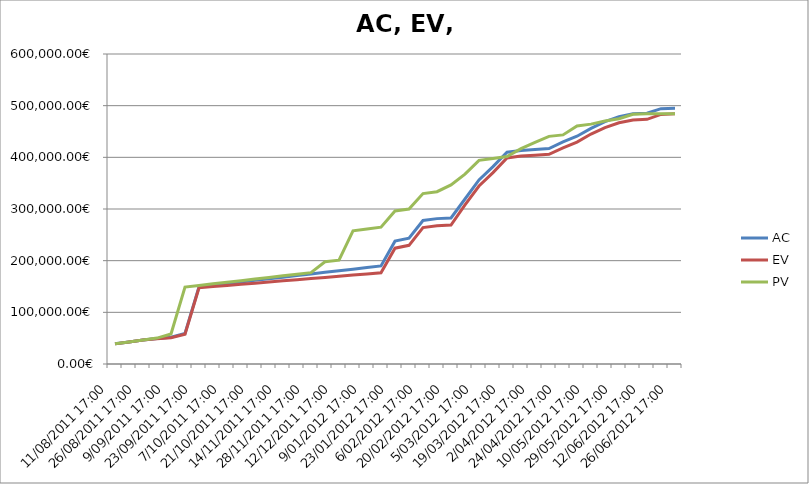
| Category | AC | EV | PV |
|---|---|---|---|
| 11/08/2011 17:00 | 39004.67 | 38967.719 | 39004.67 |
| 19/08/2011 17:00 | 42724.67 | 42650.768 | 42724.67 |
| 26/08/2011 17:00 | 46444.67 | 46333.817 | 46444.67 |
| 2/09/2011 17:00 | 49234.67 | 48729.174 | 50164.67 |
| 9/09/2011 17:00 | 51714.67 | 50695.301 | 58071.77 |
| 16/09/2011 17:00 | 59094.77 | 57653.27 | 148902.723 |
| 23/09/2011 17:00 | 149491.723 | 147599.133 | 152002.723 |
| 30/09/2011 17:00 | 152591.723 | 149824.774 | 155102.723 |
| 7/10/2011 17:00 | 155691.723 | 152050.416 | 158202.723 |
| 14/10/2011 17:00 | 158791.723 | 154276.056 | 161302.723 |
| 21/10/2011 17:00 | 161891.723 | 156501.698 | 164402.723 |
| 28/10/2011 17:00 | 164991.723 | 158727.339 | 167502.723 |
| 14/11/2011 17:00 | 168091.723 | 160952.98 | 170602.723 |
| 21/11/2011 17:00 | 171191.723 | 163178.621 | 173702.723 |
| 28/11/2011 17:00 | 174291.723 | 165404.262 | 176802.723 |
| 5/12/2011 17:00 | 177391.723 | 167629.903 | 197908.223 |
| 12/12/2011 17:00 | 180491.723 | 169855.544 | 201008.223 |
| 19/12/2011 17:00 | 183591.723 | 172081.185 | 257849.368 |
| 9/01/2012 17:00 | 186691.723 | 174306.826 | 261392.225 |
| 16/01/2012 17:00 | 189791.723 | 176532.467 | 264935.083 |
| 23/01/2012 17:00 | 237776.502 | 224148.541 | 296140.232 |
| 30/01/2012 17:00 | 243356.502 | 229696.94 | 299860.232 |
| 6/02/2012 17:00 | 277824.775 | 264040.755 | 329774.972 |
| 13/02/2012 17:00 | 281367.633 | 267428.202 | 333494.972 |
| 20/02/2012 17:00 | 282740.49 | 268893.233 | 346583.882 |
| 27/02/2012 17:00 | 319347.811 | 307773.696 | 367532.653 |
| 5/03/2012 17:00 | 356193.811 | 344471.809 | 394226.162 |
| 12/03/2012 17:00 | 381963.081 | 370520.811 | 397946.162 |
| 19/03/2012 17:00 | 409865.591 | 398705.751 | 401666.162 |
| 26/03/2012 17:00 | 413399.591 | 402591.102 | 416810.222 |
| 2/04/2012 17:00 | 415259.591 | 404204.596 | 429042.212 |
| 17/04/2012 17:00 | 417119.591 | 405818.09 | 440557.544 |
| 24/04/2012 17:00 | 429741.651 | 418280.508 | 443391.83 |
| 3/05/2012 17:00 | 440795.641 | 429467.355 | 460703.617 |
| 10/05/2012 17:00 | 456062.23 | 445093.168 | 464264.188 |
| 21/05/2012 17:00 | 469027.145 | 457448.873 | 470182.773 |
| 29/05/2012 17:00 | 478774.093 | 466807.568 | 474693.453 |
| 5/06/2012 17:00 | 484186.15 | 472396.139 | 483220.413 |
| 12/06/2012 17:00 | 485435.007 | 473575.044 | 484398.413 |
| 19/06/2012 17:00 | 494234.713 | 483061.538 | 484398.413 |
| 26/06/2012 17:00 | 494947.713 | 484398.413 | 484398.413 |